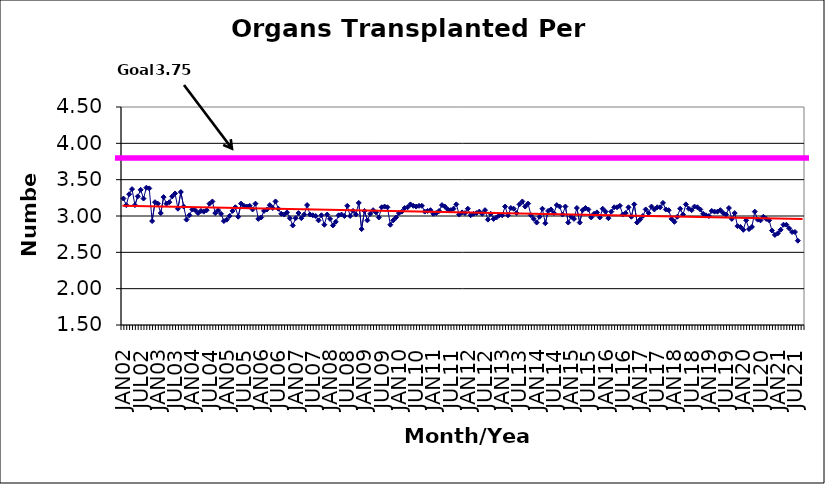
| Category | Series 0 |
|---|---|
| JAN02 | 3.24 |
| FEB02 | 3.15 |
| MAR02 | 3.3 |
| APR02 | 3.37 |
| MAY02 | 3.15 |
| JUN02 | 3.27 |
| JUL02 | 3.36 |
| AUG02 | 3.24 |
| SEP02 | 3.39 |
| OCT02 | 3.38 |
| NOV02 | 2.93 |
| DEC02 | 3.19 |
| JAN03 | 3.17 |
| FEB03 | 3.04 |
| MAR03 | 3.26 |
| APR03 | 3.17 |
| MAY03 | 3.19 |
| JUN03 | 3.27 |
| JUL03 | 3.31 |
| AUG03 | 3.1 |
| SEP03 | 3.33 |
| OCT03 | 3.13 |
| NOV03 | 2.95 |
| DEC03 | 3.01 |
| JAN04 | 3.09 |
| FEB04 | 3.08 |
| MAR04 | 3.04 |
| APR04 | 3.07 |
| MAY04 | 3.06 |
| JUN04 | 3.08 |
| JUL04 | 3.17 |
| AUG04 | 3.2 |
| SEP04 | 3.04 |
| OCT04 | 3.08 |
| NOV04 | 3.03 |
| DEC04 | 2.93 |
| JAN05 | 2.95 |
| FEB05 | 3 |
| MAR05 | 3.07 |
| APR05 | 3.12 |
| MAY05 | 2.99 |
| JUN05 | 3.17 |
| JUL05 | 3.14 |
| AUG05 | 3.13 |
| SEP05 | 3.14 |
| OCT05 | 3.09 |
| NOV05 | 3.17 |
| DEC05 | 2.96 |
| JAN06 | 2.98 |
| FEB06 | 3.07 |
| MAR06 | 3.09 |
| APR06 | 3.15 |
| MAY06 | 3.11 |
| JUN06 | 3.2 |
| JUL06 | 3.1 |
| AUG06 | 3.03 |
| SEP06 | 3.02 |
| OCT06 | 3.05 |
| NOV06 | 2.97 |
| DEC06 | 2.87 |
| JAN07 | 2.97 |
| FEB07 | 3.04 |
| MAR07 | 2.97 |
| APR07 | 3.02 |
| MAY07 | 3.15 |
| JUN07 | 3.02 |
| JUL07 | 3.01 |
| AUG07 | 3 |
| SEP07 | 2.94 |
| OCT07 | 3.01 |
| NOV07 | 2.88 |
| DEC07 | 3.02 |
| JAN08 | 2.96 |
| FEB08 | 2.87 |
| MAR08 | 2.92 |
| APR08 | 3.01 |
| MAY08 | 3.02 |
| JUN08 | 3 |
| JUL08 | 3.14 |
| AUG08 | 3 |
| SEP08 | 3.07 |
| OCT08 | 3.02 |
| NOV08 | 3.18 |
| DEC08 | 2.82 |
| JAN09 | 3.07 |
| FEB09 | 2.94 |
| MAR09 | 3.03 |
| APR09 | 3.08 |
| MAY09 | 3.05 |
| JUN09 | 2.98 |
| JUL09 | 3.12 |
| AUG09 | 3.13 |
| SEP09 | 3.12 |
| OCT09 | 2.88 |
| NOV09 | 2.94 |
| DEC09 | 2.98 |
| JAN10 | 3.04 |
| FEB10 | 3.06 |
| MAR10 | 3.11 |
| APR10 | 3.12 |
| MAY10 | 3.16 |
| JUN10 | 3.14 |
| JUL10 | 3.13 |
| AUG10 | 3.14 |
| SEP10 | 3.14 |
| OCT10 | 3.06 |
| NOV10 | 3.07 |
| DEC10 | 3.08 |
| JAN11 | 3.03 |
| FEB11 | 3.04 |
| MAR11 | 3.07 |
| APR11 | 3.15 |
| MAY11 | 3.13 |
| JUN11 | 3.09 |
| JUL11 | 3.08 |
| AUG11 | 3.1 |
| SEP11 | 3.16 |
| OCT11 | 3.02 |
| NOV11 | 3.05 |
| DEC11 | 3.04 |
| JAN12 | 3.1 |
| FEB12 | 3.01 |
| MAR12 | 3.03 |
| APR12 | 3.04 |
| MAY12 | 3.06 |
| JUN12 | 3.03 |
| JUL12 | 3.08 |
| AUG12 | 2.95 |
| SEP12 | 3.03 |
| OCT12 | 2.96 |
| NOV12 | 2.98 |
| DEC12 | 3.01 |
| JAN13 | 3.01 |
| FEB13 | 3.13 |
| MAR13 | 3.01 |
| APR13 | 3.11 |
| MAY13 | 3.1 |
| JUN13 | 3.04 |
| JUL13 | 3.16 |
| AUG13 | 3.2 |
| SEP13 | 3.13 |
| OCT13 | 3.17 |
| NOV13 | 3.01 |
| DEC13 | 2.96 |
| JAN14 | 2.91 |
| FEB14 | 2.99 |
| MAR14 | 3.1 |
| APR14 | 2.9 |
| MAY14 | 3.07 |
| JUN14 | 3.09 |
| JUL14 | 3.04 |
| AUG14 | 3.15 |
| SEP14 | 3.13 |
| OCT14 | 3.02 |
| NOV14 | 3.13 |
| DEC14 | 2.91 |
| JAN15 | 2.99 |
| FEB15 | 2.96 |
| MAR15 | 3.11 |
| APR15 | 2.91 |
| MAY15 | 3.08 |
| JUN15 | 3.11 |
| JUL15 | 3.09 |
| AUG15 | 2.98 |
| SEP15 | 3.03 |
| OCT15 | 3.05 |
| NOV15 | 2.98 |
| DEC15 | 3.1 |
| JAN16 | 3.06 |
| FEB16 | 2.97 |
| MAR16 | 3.06 |
| APR16 | 3.12 |
| MAY16 | 3.12 |
| JUN16 | 3.14 |
| JUL16 | 3.02 |
| AUG16 | 3.04 |
| SEP16 | 3.12 |
| OCT16 | 2.99 |
| NOV16 | 3.16 |
| DEC16 | 2.91 |
| JAN17 | 2.95 |
| FEB17 | 3 |
| MAR17 | 3.09 |
| APR17 | 3.04 |
| MAY17 | 3.13 |
| JUN17 | 3.09 |
| JUL17 | 3.12 |
| AUG17 | 3.12 |
| SEP17 | 3.18 |
| OCT17 | 3.09 |
| NOV17 | 3.08 |
| DEC17 | 2.96 |
| JAN18 | 2.92 |
| FEB18 | 2.99 |
| MAR18 | 3.1 |
| APR18 | 3.02 |
| MAY18 | 3.16 |
| JUN18 | 3.1 |
| JUL18 | 3.08 |
| AUG18 | 3.13 |
| SEP18 | 3.12 |
| OCT18 | 3.09 |
| NOV18 | 3.03 |
| DEC18 | 3.01 |
| JAN19 | 3 |
| FEB19 | 3.07 |
| MAR19 | 3.06 |
| APR19 | 3.06 |
| MAY19 | 3.08 |
| JUN19 | 3.04 |
| JUL19 | 3.02 |
| AUG19 | 3.11 |
| SEP19 | 2.96 |
| OCT19 | 3.04 |
| NOV19 | 2.86 |
| DEC19 | 2.85 |
| JAN20 | 2.81 |
| FEB20 | 2.94 |
| MAR20 | 2.82 |
| APR20 | 2.85 |
| MAY20 | 3.06 |
| JUN20 | 2.95 |
| JUL20 | 2.94 |
| AUG20 | 2.99 |
| SEP20 | 2.96 |
| OCT20 | 2.94 |
| NOV20 | 2.8 |
| DEC20 | 2.74 |
| JAN21 | 2.76 |
| FEB21 | 2.81 |
| MAR21 | 2.88 |
| APR21 | 2.88 |
| MAY21 | 2.83 |
| JUN21 | 2.78 |
| JUL21 | 2.78 |
| AUG21 | 2.66 |